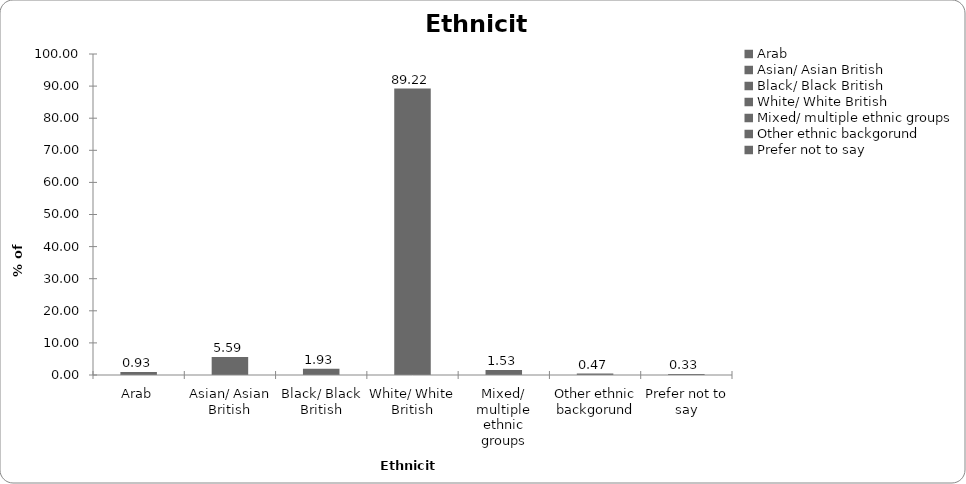
| Category | Ethnicity |
|---|---|
| Arab | 0.931 |
| Asian/ Asian British | 5.589 |
| Black/ Black British | 1.929 |
| White/ White British | 89.222 |
| Mixed/ multiple ethnic groups | 1.53 |
| Other ethnic backgorund | 0.466 |
| Prefer not to say | 0.333 |